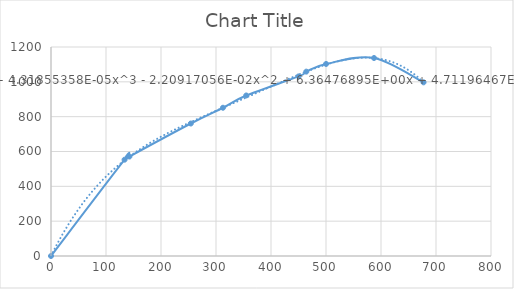
| Category | Series 0 |
|---|---|
| 0.0 | 0 |
| 133.768339 | 553 |
| 142.571774 | 571.054 |
| 254.186551 | 760.7 |
| 312.667623 | 851.221 |
| 354.986764 | 921.676 |
| 450.174779 | 1031.276 |
| 464.177143 | 1058.561 |
| 500.134295 | 1102.665 |
| 587.303999 | 1136.808 |
| 677.341451 | 997.085 |